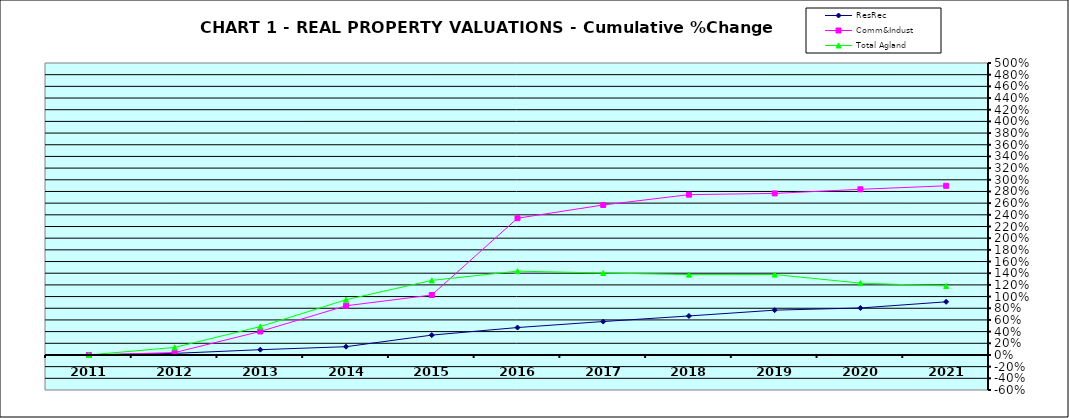
| Category | ResRec | Comm&Indust | Total Agland |
|---|---|---|---|
| 2011.0 | 0 | 0 | 0 |
| 2012.0 | 0.027 | 0.041 | 0.129 |
| 2013.0 | 0.091 | 0.403 | 0.486 |
| 2014.0 | 0.142 | 0.842 | 0.945 |
| 2015.0 | 0.34 | 1.027 | 1.277 |
| 2016.0 | 0.47 | 2.342 | 1.435 |
| 2017.0 | 0.573 | 2.569 | 1.404 |
| 2018.0 | 0.668 | 2.745 | 1.376 |
| 2019.0 | 0.767 | 2.767 | 1.377 |
| 2020.0 | 0.805 | 2.837 | 1.23 |
| 2021.0 | 0.91 | 2.897 | 1.181 |